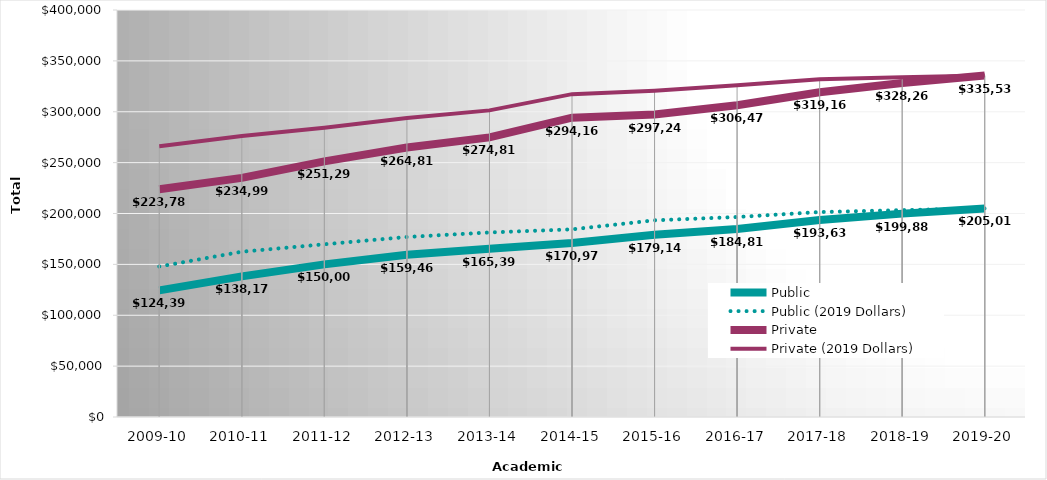
| Category | Public | Public (2019 Dollars) | Private | Private (2019 Dollars) |
|---|---|---|---|---|
| 2009-10 | 124397 | 147891.826 | 223788 | 266054.775 |
| 2010-11 | 138174 | 162413.384 | 234992 | 276215.829 |
| 2011-12 | 150007 | 169755.463 | 251290 | 284372.397 |
| 2012-13 | 159460 | 176929.781 | 264810 | 293821.492 |
| 2013-14 | 165394 | 181364.852 | 274811 | 301347.426 |
| 2014-15 | 170971 | 184422.8 | 294169 | 317313.876 |
| 2015-16 | 179142.68 | 193307.254 | 297246.04 | 320748.889 |
| 2016-17 | 184815.95 | 196552.01 | 306475.19 | 325936.774 |
| 2017-18 | 193638.08 | 201436.354 | 319168.58 | 332022.272 |
| 2018-19 | 199881.23 | 203301.805 | 328260.54 | 333878.075 |
| 2019-20 | 205019.28 | 205019.28 | 335535.93 | 335535.93 |